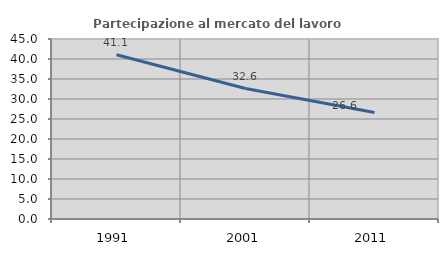
| Category | Partecipazione al mercato del lavoro  femminile |
|---|---|
| 1991.0 | 41.059 |
| 2001.0 | 32.609 |
| 2011.0 | 26.611 |